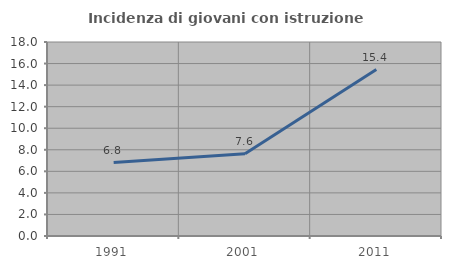
| Category | Incidenza di giovani con istruzione universitaria |
|---|---|
| 1991.0 | 6.818 |
| 2001.0 | 7.639 |
| 2011.0 | 15.441 |